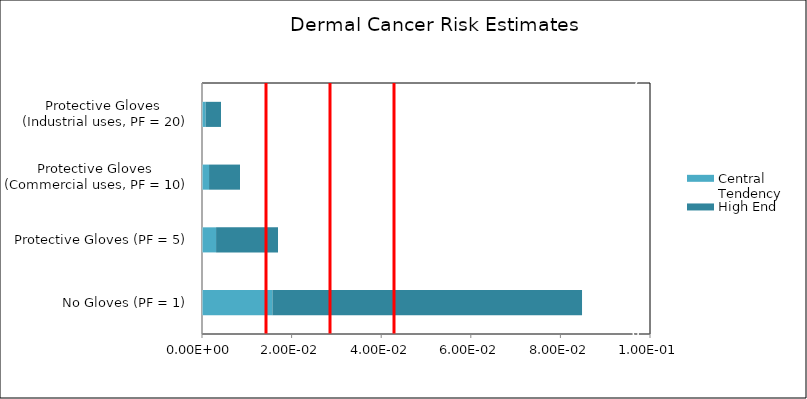
| Category | Central Tendency | High End |
|---|---|---|
| No Gloves (PF = 1) | 0.016 | 0.069 |
| Protective Gloves (PF = 5) | 0.003 | 0.014 |
| Protective Gloves 
(Commercial uses, PF = 10) | 0.002 | 0.007 |
| Protective Gloves 
(Industrial uses, PF = 20) | 0.001 | 0.003 |